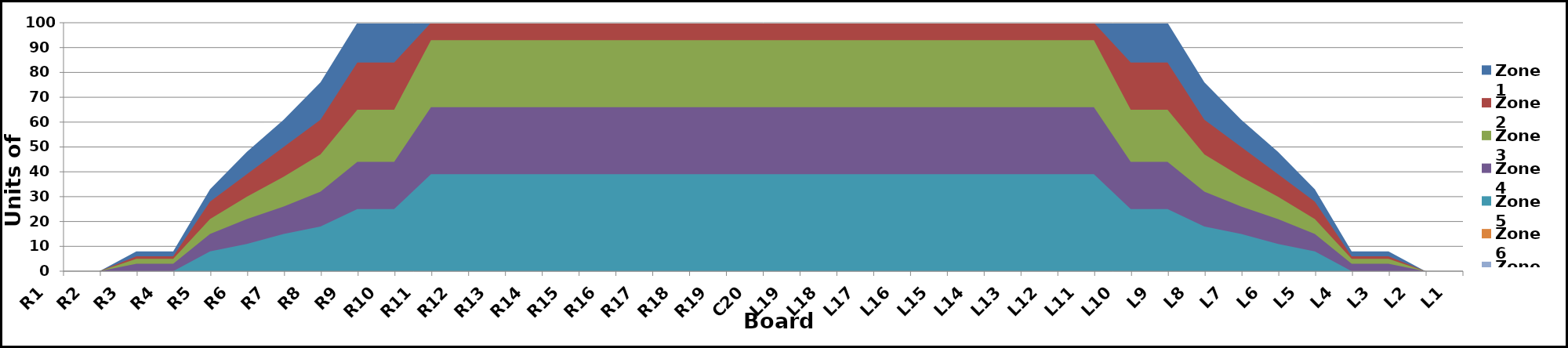
| Category | Zone 1 | Zone 2 | Zone 3 | Zone 4 | Zone 5 | Zone 6 | Zone 7 | Zone 8 |
|---|---|---|---|---|---|---|---|---|
| L1 | 0 | 0 | 0 | 0 | 0 | 0 | 0 | 0 |
| L2 | 0 | 0 | 0 | 0 | 0 | 0 | 0 | 0 |
| L3 | 8 | 6 | 5 | 3 | 0 | 0 | 0 | 0 |
| L4 | 8 | 6 | 5 | 3 | 0 | 0 | 0 | 0 |
| L5 | 33 | 28 | 21 | 15 | 8 | 0 | 0 | 0 |
| L6 | 48 | 39 | 30 | 21 | 11 | 0 | 0 | 0 |
| L7 | 61 | 50 | 38 | 26 | 15 | 0 | 0 | 0 |
| L8 | 76 | 61 | 47 | 32 | 18 | 0 | 0 | 0 |
| L9 | 100 | 84 | 65 | 44 | 25 | 0 | 0 | 0 |
| L10 | 100 | 84 | 65 | 44 | 25 | 0 | 0 | 0 |
| L11 | 100 | 100 | 93 | 66 | 39 | 0 | 0 | 0 |
| L12 | 100 | 100 | 93 | 66 | 39 | 0 | 0 | 0 |
| L13 | 100 | 100 | 93 | 66 | 39 | 0 | 0 | 0 |
| L14 | 100 | 100 | 93 | 66 | 39 | 0 | 0 | 0 |
| L15 | 100 | 100 | 93 | 66 | 39 | 0 | 0 | 0 |
| L16 | 100 | 100 | 93 | 66 | 39 | 0 | 0 | 0 |
| L17 | 100 | 100 | 93 | 66 | 39 | 0 | 0 | 0 |
| L18 | 100 | 100 | 93 | 66 | 39 | 0 | 0 | 0 |
| L19 | 100 | 100 | 93 | 66 | 39 | 0 | 0 | 0 |
| C20 | 100 | 100 | 93 | 66 | 39 | 0 | 0 | 0 |
| R19 | 100 | 100 | 93 | 66 | 39 | 0 | 0 | 0 |
| R18 | 100 | 100 | 93 | 66 | 39 | 0 | 0 | 0 |
| R17 | 100 | 100 | 93 | 66 | 39 | 0 | 0 | 0 |
| R16 | 100 | 100 | 93 | 66 | 39 | 0 | 0 | 0 |
| R15 | 100 | 100 | 93 | 66 | 39 | 0 | 0 | 0 |
| R14 | 100 | 100 | 93 | 66 | 39 | 0 | 0 | 0 |
| R13 | 100 | 100 | 93 | 66 | 39 | 0 | 0 | 0 |
| R12 | 100 | 100 | 93 | 66 | 39 | 0 | 0 | 0 |
| R11 | 100 | 100 | 93 | 66 | 39 | 0 | 0 | 0 |
| R10 | 100 | 84 | 65 | 44 | 25 | 0 | 0 | 0 |
| R9 | 100 | 84 | 65 | 44 | 25 | 0 | 0 | 0 |
| R8 | 76 | 61 | 47 | 32 | 18 | 0 | 0 | 0 |
| R7 | 61 | 50 | 38 | 26 | 15 | 0 | 0 | 0 |
| R6 | 48 | 39 | 30 | 21 | 11 | 0 | 0 | 0 |
| R5 | 33 | 28 | 21 | 15 | 8 | 0 | 0 | 0 |
| R4 | 8 | 6 | 5 | 3 | 0 | 0 | 0 | 0 |
| R3 | 8 | 6 | 5 | 3 | 0 | 0 | 0 | 0 |
| R2 | 0 | 0 | 0 | 0 | 0 | 0 | 0 | 0 |
| R1 | 0 | 0 | 0 | 0 | 0 | 0 | 0 | 0 |